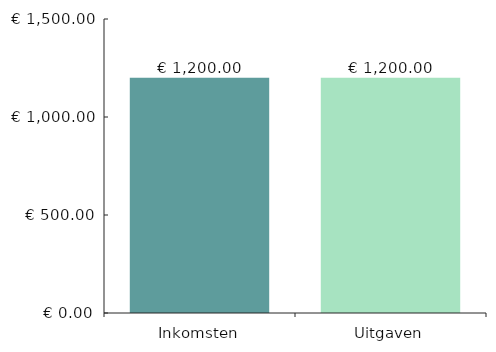
| Category | Grafiekgegevens |
|---|---|
| 0 | 1200 |
| 1 | 1200 |